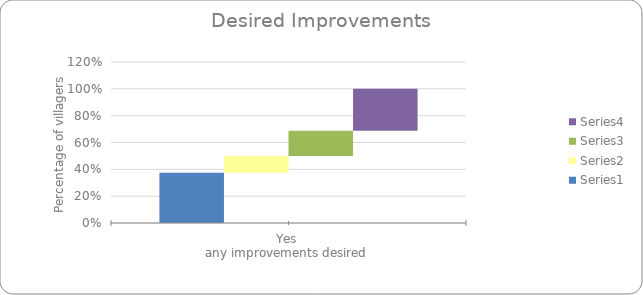
| Category | Series 0 | Series 1 | Series 2 | Series 3 |
|---|---|---|---|---|
| Yes | 0.375 | 0.125 | 0.188 | 0.312 |